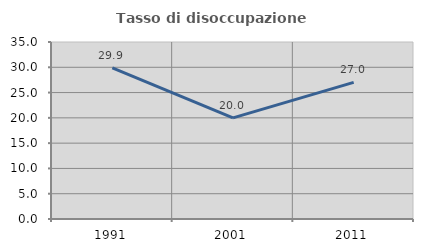
| Category | Tasso di disoccupazione giovanile  |
|---|---|
| 1991.0 | 29.87 |
| 2001.0 | 20 |
| 2011.0 | 27.027 |